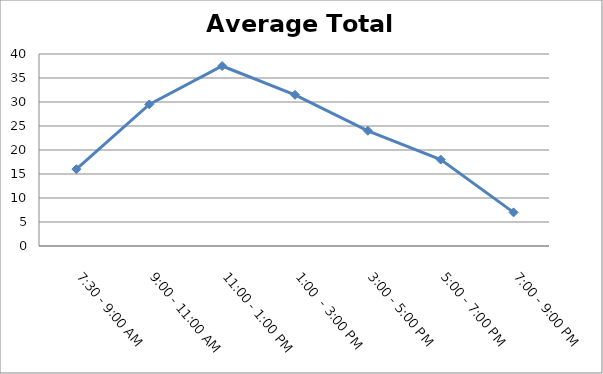
| Category | Total |
|---|---|
| 7:30 - 9:00 AM | 16 |
| 9:00 - 11:00 AM | 29.5 |
| 11:00 - 1:00 PM | 37.5 |
| 1:00  - 3:00 PM | 31.5 |
| 3:00 - 5:00 PM | 24 |
| 5:00 - 7:00 PM | 18 |
| 7:00 - 9:00 PM | 7 |